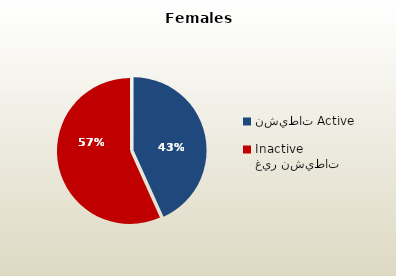
| Category | الاناث القطريات  Qatari Females |
|---|---|
| نشيطات Active | 49612 |
| غير نشيطات Inactive | 65063 |